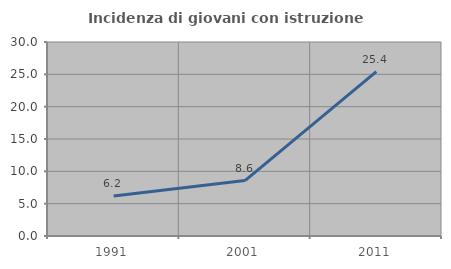
| Category | Incidenza di giovani con istruzione universitaria |
|---|---|
| 1991.0 | 6.173 |
| 2001.0 | 8.571 |
| 2011.0 | 25.424 |